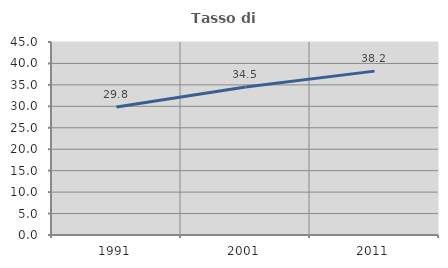
| Category | Tasso di occupazione   |
|---|---|
| 1991.0 | 29.828 |
| 2001.0 | 34.519 |
| 2011.0 | 38.211 |